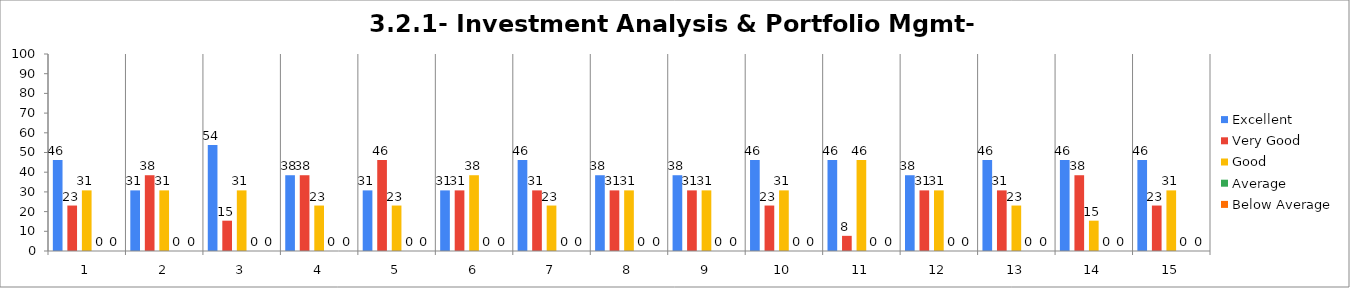
| Category | Excellent | Very Good | Good | Average | Below Average |
|---|---|---|---|---|---|
| 0 | 46.154 | 23.077 | 30.769 | 0 | 0 |
| 1 | 30.769 | 38.462 | 30.769 | 0 | 0 |
| 2 | 53.846 | 15.385 | 30.769 | 0 | 0 |
| 3 | 38.462 | 38.462 | 23.077 | 0 | 0 |
| 4 | 30.769 | 46.154 | 23.077 | 0 | 0 |
| 5 | 30.769 | 30.769 | 38.462 | 0 | 0 |
| 6 | 46.154 | 30.769 | 23.077 | 0 | 0 |
| 7 | 38.462 | 30.769 | 30.769 | 0 | 0 |
| 8 | 38.462 | 30.769 | 30.769 | 0 | 0 |
| 9 | 46.154 | 23.077 | 30.769 | 0 | 0 |
| 10 | 46.154 | 7.692 | 46.154 | 0 | 0 |
| 11 | 38.462 | 30.769 | 30.769 | 0 | 0 |
| 12 | 46.154 | 30.769 | 23.077 | 0 | 0 |
| 13 | 46.154 | 38.462 | 15.385 | 0 | 0 |
| 14 | 46.154 | 23.077 | 30.769 | 0 | 0 |